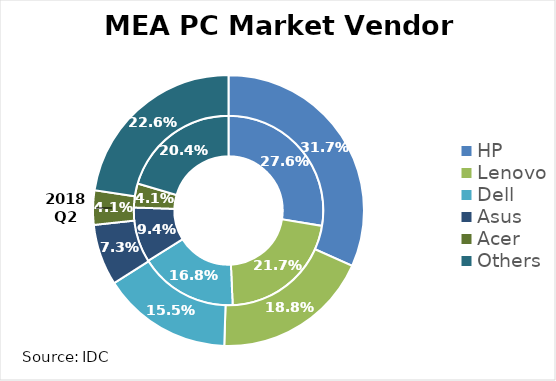
| Category | 2017 Q2 | 2018 Q2 |
|---|---|---|
| HP | 0.276 | 0.317 |
| Lenovo | 0.217 | 0.188 |
| Dell | 0.168 | 0.155 |
| Asus | 0.094 | 0.073 |
| Acer | 0.041 | 0.041 |
| Others | 0.204 | 0.226 |